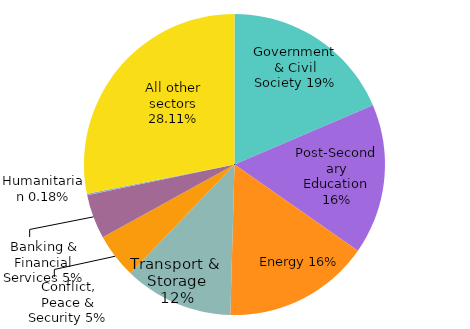
| Category | Series 0 |
|---|---|
| Government & Civil Society | 0.186 |
| Post-Secondary Education | 0.161 |
| Energy | 0.157 |
| Transport & Storage | 0.117 |
| Conflict, Peace & Security | 0.048 |
| Banking & Financial Services | 0.047 |
| Humanitarian | 0.002 |
| All other sectors | 0.281 |